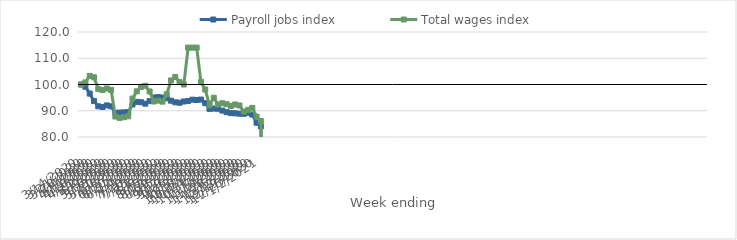
| Category | Payroll jobs index | Total wages index |
|---|---|---|
| 14/03/2020 | 100 | 100 |
| 21/03/2020 | 99.148 | 100.802 |
| 28/03/2020 | 96.541 | 103.272 |
| 04/04/2020 | 93.685 | 102.754 |
| 11/04/2020 | 91.699 | 98.24 |
| 18/04/2020 | 91.421 | 97.883 |
| 25/04/2020 | 92.044 | 98.479 |
| 02/05/2020 | 91.707 | 97.933 |
| 09/05/2020 | 89.189 | 87.79 |
| 16/05/2020 | 89.31 | 87.279 |
| 23/05/2020 | 89.371 | 87.546 |
| 30/05/2020 | 89.46 | 87.888 |
| 06/06/2020 | 92.413 | 94.629 |
| 13/06/2020 | 93.386 | 97.39 |
| 20/06/2020 | 93.236 | 99.09 |
| 27/06/2020 | 92.693 | 99.514 |
| 04/07/2020 | 93.679 | 97.339 |
| 11/07/2020 | 95.046 | 93.524 |
| 18/07/2020 | 95.204 | 93.874 |
| 25/07/2020 | 95.03 | 93.477 |
| 01/08/2020 | 94.729 | 96.268 |
| 08/08/2020 | 93.824 | 101.546 |
| 15/08/2020 | 93.217 | 102.87 |
| 22/08/2020 | 93.06 | 100.94 |
| 29/08/2020 | 93.525 | 99.991 |
| 05/09/2020 | 93.705 | 114.05 |
| 12/09/2020 | 94.226 | 114.05 |
| 19/09/2020 | 94.1 | 114.047 |
| 26/09/2020 | 94.264 | 100.972 |
| 03/10/2020 | 92.892 | 98.1 |
| 10/10/2020 | 90.72 | 92.13 |
| 17/10/2020 | 90.838 | 94.947 |
| 24/10/2020 | 90.761 | 92.378 |
| 31/10/2020 | 90.056 | 92.862 |
| 07/11/2020 | 89.468 | 92.49 |
| 14/11/2020 | 89.092 | 91.804 |
| 21/11/2020 | 89.021 | 92.391 |
| 28/11/2020 | 88.897 | 92.002 |
| 05/12/2020 | 88.837 | 89.681 |
| 12/12/2020 | 89.243 | 90.312 |
| 19/12/2020 | 88.542 | 91.092 |
| 26/12/2020 | 85.443 | 87.752 |
| 02/01/2021 | 84.078 | 86.113 |